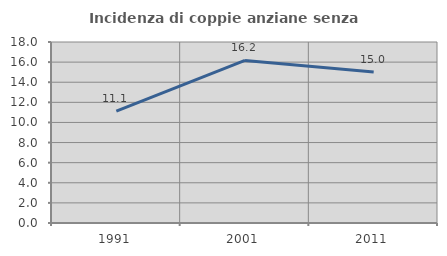
| Category | Incidenza di coppie anziane senza figli  |
|---|---|
| 1991.0 | 11.129 |
| 2001.0 | 16.171 |
| 2011.0 | 15.017 |